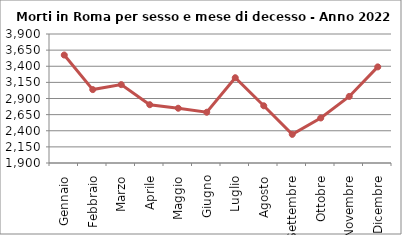
| Category | Series 0 |
|---|---|
| Gennaio | 3574 |
| Febbraio | 3038 |
| Marzo | 3115 |
| Aprile | 2804 |
| Maggio | 2749 |
| Giugno | 2687 |
| Luglio | 3222 |
| Agosto | 2787 |
| Settembre | 2344 |
| Ottobre | 2598 |
| Novembre | 2932 |
| Dicembre | 3390 |